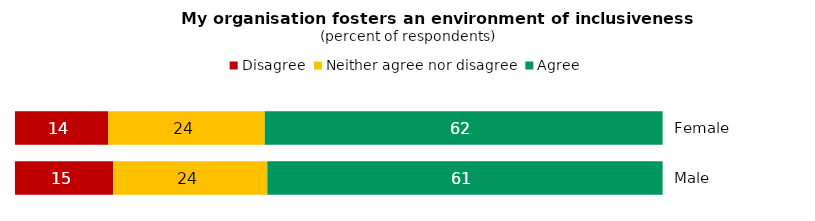
| Category | xx | Disagree | Neither agree nor disagree | Agree |
|---|---|---|---|---|
| Female |  | 14.4 | 24.2 | 61.5 |
| Male |  | 15.2 | 23.8 | 61.1 |